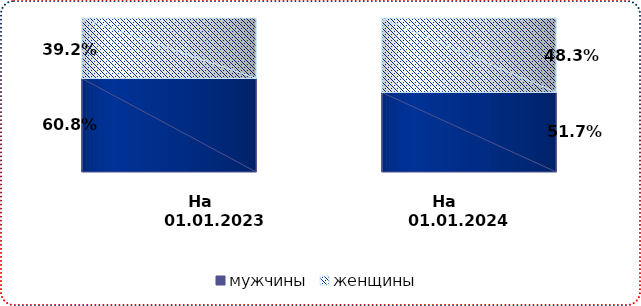
| Category | мужчины | женщины |
|---|---|---|
| на 
01.01.2023 | 0.608 | 0.392 |
| на 
01.01.2024 | 0.517 | 0.483 |